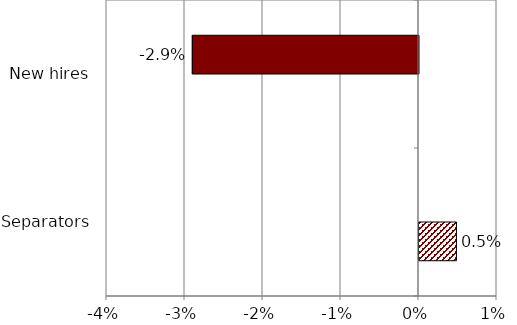
| Category | Not statistically significant | Statistically significant |
|---|---|---|
| Separators | 0.005 | 0 |
| New hires | 0 | -0.029 |